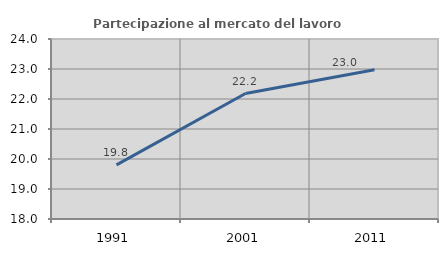
| Category | Partecipazione al mercato del lavoro  femminile |
|---|---|
| 1991.0 | 19.803 |
| 2001.0 | 22.182 |
| 2011.0 | 22.975 |